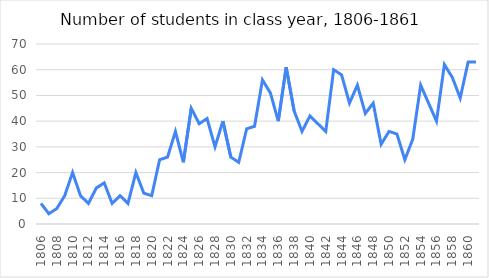
| Category | N |
|---|---|
| 1806.0 | 8 |
| 1807.0 | 4 |
| 1808.0 | 6 |
| 1809.0 | 11 |
| 1810.0 | 20 |
| 1811.0 | 11 |
| 1812.0 | 8 |
| 1813.0 | 14 |
| 1814.0 | 16 |
| 1815.0 | 8 |
| 1816.0 | 11 |
| 1817.0 | 8 |
| 1818.0 | 20 |
| 1819.0 | 12 |
| 1820.0 | 11 |
| 1821.0 | 25 |
| 1822.0 | 26 |
| 1823.0 | 36 |
| 1824.0 | 24 |
| 1825.0 | 45 |
| 1826.0 | 39 |
| 1827.0 | 41 |
| 1828.0 | 30 |
| 1829.0 | 40 |
| 1830.0 | 26 |
| 1831.0 | 24 |
| 1832.0 | 37 |
| 1833.0 | 38 |
| 1834.0 | 56 |
| 1835.0 | 51 |
| 1836.0 | 40 |
| 1837.0 | 61 |
| 1838.0 | 44 |
| 1839.0 | 36 |
| 1840.0 | 42 |
| 1841.0 | 39 |
| 1842.0 | 36 |
| 1843.0 | 60 |
| 1844.0 | 58 |
| 1845.0 | 47 |
| 1846.0 | 54 |
| 1847.0 | 43 |
| 1848.0 | 47 |
| 1849.0 | 31 |
| 1850.0 | 36 |
| 1851.0 | 35 |
| 1852.0 | 25 |
| 1853.0 | 33 |
| 1854.0 | 54 |
| 1855.0 | 47 |
| 1856.0 | 40 |
| 1857.0 | 62 |
| 1858.0 | 57 |
| 1859.0 | 49 |
| 1860.0 | 63 |
| 1861.0 | 63 |